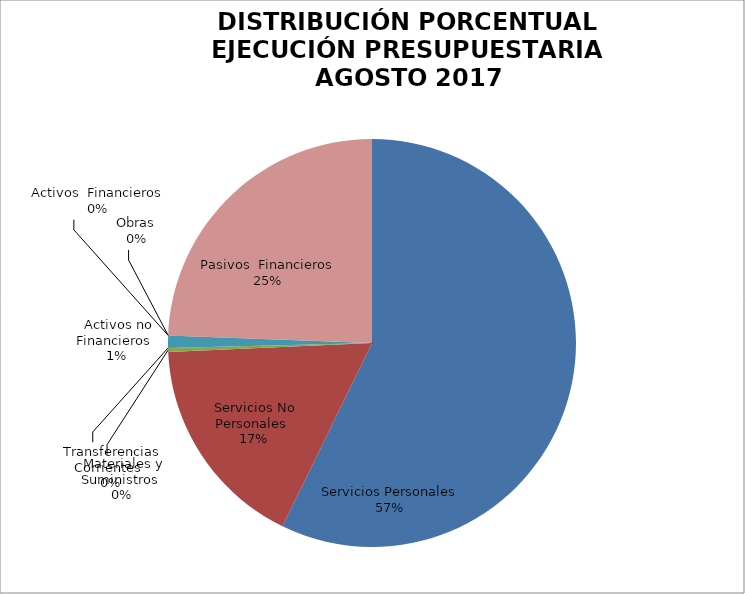
| Category | Series 0 | Series 1 |
|---|---|---|
| Servicios Personales | 11568493.41 | 0.572 |
| Servicios No Personales | 3447850.38 | 0.171 |
| Materiales y Suministros | 64393.1 | 0.003 |
| Transferencias Corrientes | 0 | 0 |
| Activos no Financieros | 199060.1 | 0.01 |
| Obras | 0 | 0 |
| Activos  Financieros | 0 | 0 |
| Pasivos  Financieros | 4933291.08 | 0.244 |